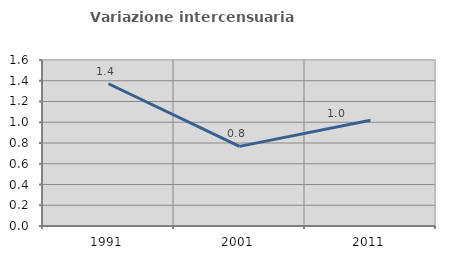
| Category | Variazione intercensuaria annua |
|---|---|
| 1991.0 | 1.371 |
| 2001.0 | 0.768 |
| 2011.0 | 1.02 |